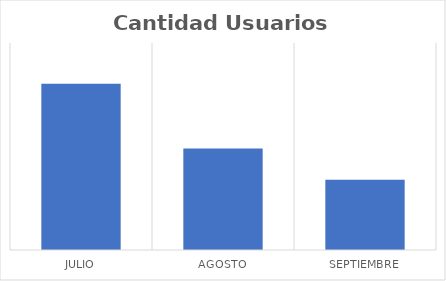
| Category | Cantidad Usuarios Pagados |
|---|---|
| Julio | 15411 |
| Agosto | 14471 |
| Septiembre | 14018 |